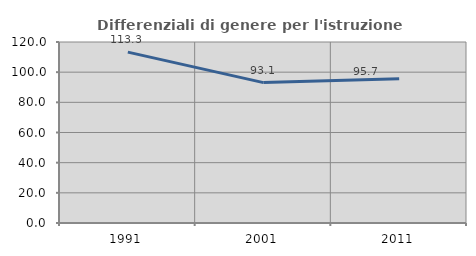
| Category | Differenziali di genere per l'istruzione superiore |
|---|---|
| 1991.0 | 113.299 |
| 2001.0 | 93.078 |
| 2011.0 | 95.713 |